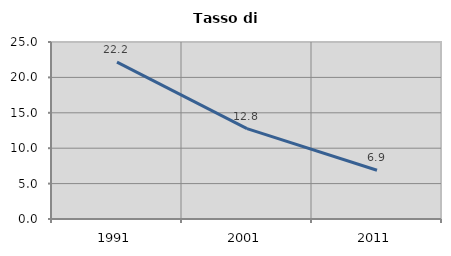
| Category | Tasso di disoccupazione   |
|---|---|
| 1991.0 | 22.161 |
| 2001.0 | 12.774 |
| 2011.0 | 6.884 |